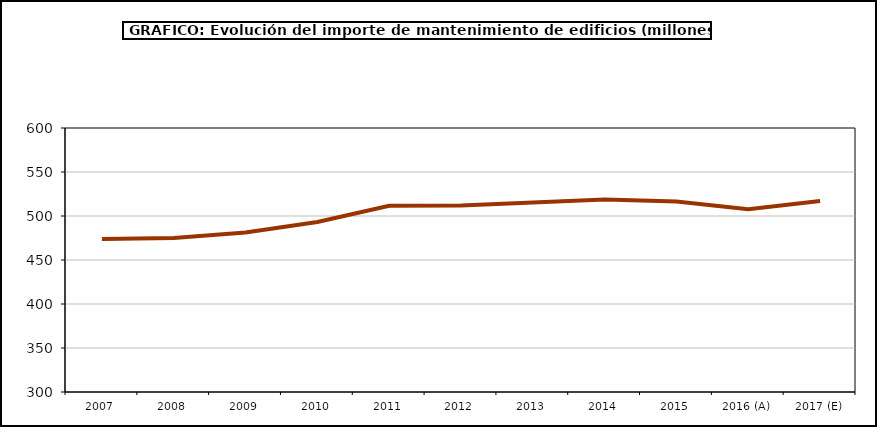
| Category | mantenimiento |
|---|---|
| 2007 | 473.87 |
| 2008 | 474.915 |
| 2009 | 481.186 |
| 2010 | 493.233 |
| 2011 | 511.585 |
| 2012 | 512.04 |
| 2013 | 515.387 |
| 2014 | 518.885 |
| 2015 | 516.507 |
| 2016 (A) | 507.665 |
| 2017 (E) | 516.98 |